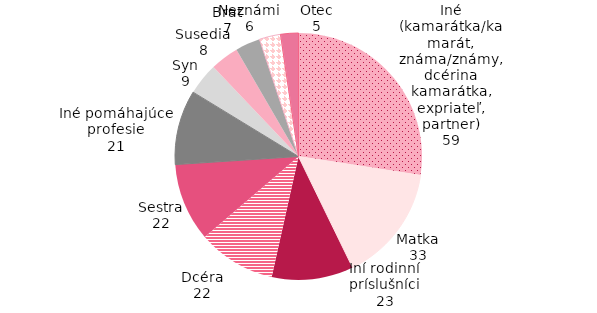
| Category | Series 0 |
|---|---|
| Iné (kamarátka/kamarát, známa/známy, dcérina kamarátka, expriateľ, partner) | 59 |
| Matka | 33 |
| Iní rodinní príslušníci | 23 |
| Dcéra | 22 |
| Sestra | 22 |
| Iné pomáhajúce profesie | 21 |
| Syn | 9 |
| Susedia | 8 |
| Brat | 7 |
| Neznámi | 6 |
| Otec | 5 |